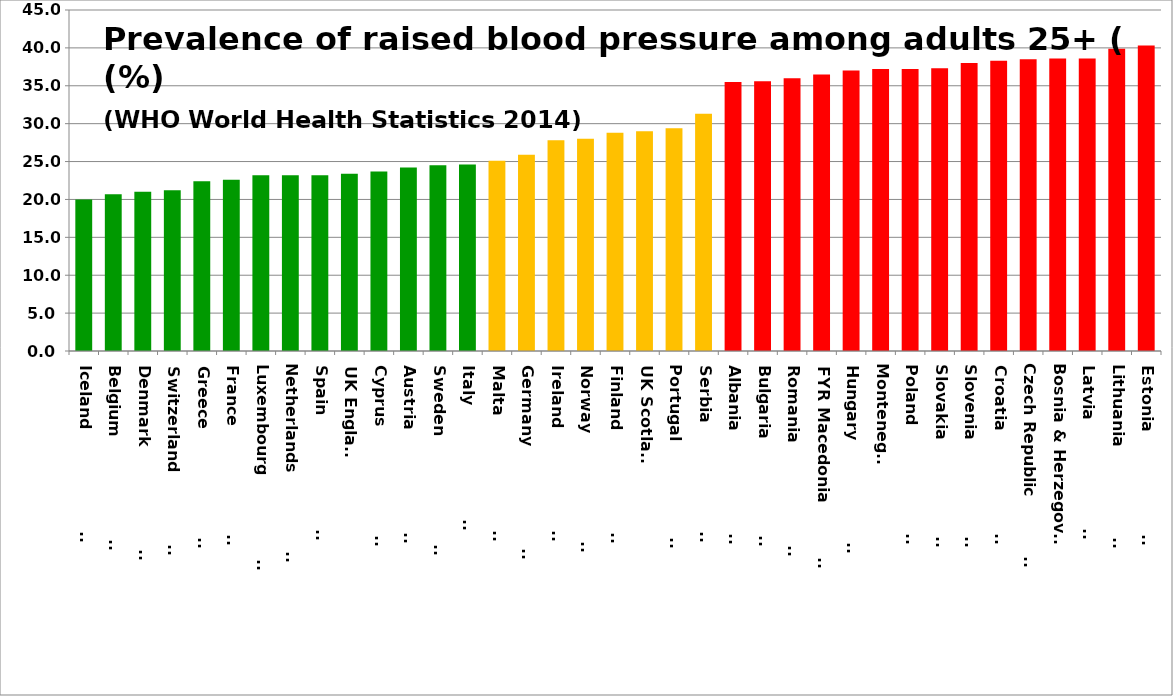
| Category | Series 0 |
|---|---|
| Iceland                       | 20 |
| Belgium                       | 20.7 |
| Denmark                       | 21 |
| Switzerland                   | 21.2 |
| Greece                        | 22.4 |
| France                        | 22.6 |
| Luxembourg                    | 23.2 |
| Netherlands                   | 23.2 |
| Spain                         | 23.2 |
| UK England | 23.4 |
| Cyprus                        | 23.7 |
| Austria                       | 24.2 |
| Sweden                        | 24.5 |
| Italy                         | 24.6 |
| Malta                         | 25.1 |
| Germany                       | 25.9 |
| Ireland                       | 27.8 |
| Norway                        | 28 |
| Finland                       | 28.8 |
| UK Scotland | 29 |
| Portugal                      | 29.4 |
| Serbia                        | 31.3 |
| Albania                       | 35.5 |
| Bulgaria                      | 35.6 |
| Romania                       | 36 |
| FYR Macedonia                | 36.5 |
| Hungary                       | 37 |
| Montenegro | 37.2 |
| Poland                        | 37.2 |
| Slovakia                      | 37.3 |
| Slovenia                      | 38 |
| Croatia                       | 38.3 |
| Czech Republic                | 38.5 |
| Bosnia & Herzegovina | 38.6 |
| Latvia                        | 38.6 |
| Lithuania                     | 39.9 |
| Estonia                       | 40.3 |